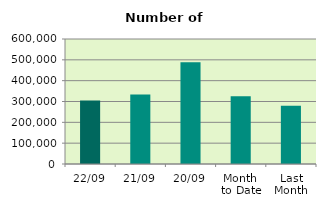
| Category | Series 0 |
|---|---|
| 22/09 | 304786 |
| 21/09 | 334200 |
| 20/09 | 488112 |
| Month 
to Date | 325553.875 |
| Last
Month | 279794.182 |